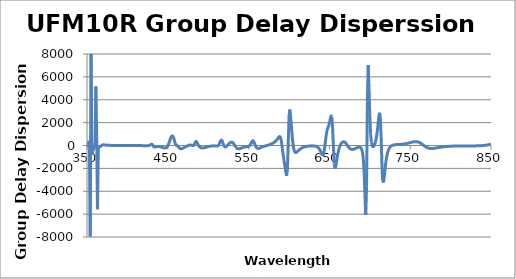
| Category | Group Delay Dispersion (fs^2) |
|---|---|
| 350.0 | -78 |
| 351.0 | 111 |
| 352.0 | 304 |
| 353.0 | -233 |
| 354.0 | -7963 |
| 355.0 | 8974 |
| 356.0 | -802 |
| 357.0 | -512 |
| 358.0 | -295 |
| 359.0 | -137 |
| 360.0 | 287 |
| 361.0 | 5158 |
| 362.0 | 761 |
| 363.0 | -5574 |
| 364.0 | -327 |
| 365.0 | -79 |
| 366.0 | -87 |
| 367.0 | -61 |
| 368.0 | 0 |
| 369.0 | 46 |
| 370.0 | 62 |
| 371.0 | 60 |
| 372.0 | 51 |
| 373.0 | 41 |
| 374.0 | 33 |
| 375.0 | 27 |
| 376.0 | 22 |
| 377.0 | 18 |
| 378.0 | 16 |
| 379.0 | 13 |
| 380.0 | 10 |
| 381.0 | 7 |
| 382.0 | 4 |
| 383.0 | 2 |
| 384.0 | 1 |
| 385.0 | 1 |
| 386.0 | 1 |
| 387.0 | 2 |
| 388.0 | 2 |
| 389.0 | 2 |
| 390.0 | 2 |
| 391.0 | 2 |
| 392.0 | 2 |
| 393.0 | 2 |
| 394.0 | 2 |
| 395.0 | 2 |
| 396.0 | 1 |
| 397.0 | 1 |
| 398.0 | 0 |
| 399.0 | -1 |
| 400.0 | 3 |
| 401.0 | -3 |
| 402.0 | -3 |
| 403.0 | -3 |
| 404.0 | -3 |
| 405.0 | -3 |
| 406.0 | -3 |
| 407.0 | -3 |
| 408.0 | -3 |
| 409.0 | -2 |
| 410.0 | -2 |
| 411.0 | -2 |
| 412.0 | -3 |
| 413.0 | -3 |
| 414.0 | -4 |
| 415.0 | -6 |
| 416.0 | -7 |
| 417.0 | -9 |
| 418.0 | -11 |
| 419.0 | -12 |
| 420.0 | -14 |
| 421.0 | -15 |
| 422.0 | -16 |
| 423.0 | -18 |
| 424.0 | -18 |
| 425.0 | -16 |
| 426.0 | -9 |
| 427.0 | 9 |
| 428.0 | 42 |
| 429.0 | 88 |
| 430.0 | 115 |
| 431.0 | 70 |
| 432.0 | -46 |
| 433.0 | -132 |
| 434.0 | -136 |
| 435.0 | -111 |
| 436.0 | -95 |
| 437.0 | -88 |
| 438.0 | -88 |
| 439.0 | -94 |
| 440.0 | -106 |
| 441.0 | -122 |
| 442.0 | -142 |
| 443.0 | -164 |
| 444.0 | -186 |
| 445.0 | -205 |
| 446.0 | -216 |
| 447.0 | -212 |
| 448.0 | -186 |
| 449.0 | -130 |
| 450.0 | -28 |
| 451.0 | 129 |
| 452.0 | 338 |
| 453.0 | 558 |
| 454.0 | 732 |
| 455.0 | 824 |
| 456.0 | 828 |
| 457.0 | 723 |
| 458.0 | 484 |
| 459.0 | 214 |
| 460.0 | 58 |
| 461.0 | 5 |
| 462.0 | -38 |
| 463.0 | -111 |
| 464.0 | -194 |
| 465.0 | -258 |
| 466.0 | -287 |
| 467.0 | -284 |
| 468.0 | -259 |
| 469.0 | -224 |
| 470.0 | -184 |
| 471.0 | -145 |
| 472.0 | -107 |
| 473.0 | -71 |
| 474.0 | -38 |
| 475.0 | -8 |
| 476.0 | 17 |
| 477.0 | 33 |
| 478.0 | 38 |
| 479.0 | 29 |
| 480.0 | 9 |
| 481.0 | -7 |
| 482.0 | 17 |
| 483.0 | 119 |
| 484.0 | 275 |
| 485.0 | 363 |
| 486.0 | 297 |
| 487.0 | 144 |
| 488.0 | 2 |
| 489.0 | -94 |
| 490.0 | -154 |
| 491.0 | -190 |
| 492.0 | -209 |
| 493.0 | -215 |
| 494.0 | -211 |
| 495.0 | -200 |
| 496.0 | -184 |
| 497.0 | -166 |
| 498.0 | -146 |
| 499.0 | -126 |
| 500.0 | -88 |
| 501.0 | -82 |
| 502.0 | -68 |
| 503.0 | -56 |
| 504.0 | -45 |
| 505.0 | -37 |
| 506.0 | -31 |
| 507.0 | -30 |
| 508.0 | -32 |
| 509.0 | -40 |
| 510.0 | -49 |
| 511.0 | -52 |
| 512.0 | -30 |
| 513.0 | 42 |
| 514.0 | 179 |
| 515.0 | 350 |
| 516.0 | 464 |
| 517.0 | 434 |
| 518.0 | 264 |
| 519.0 | 57 |
| 520.0 | -87 |
| 521.0 | -136 |
| 522.0 | -113 |
| 523.0 | -53 |
| 524.0 | 23 |
| 525.0 | 101 |
| 526.0 | 174 |
| 527.0 | 237 |
| 528.0 | 280 |
| 529.0 | 297 |
| 530.0 | 276 |
| 531.0 | 214 |
| 532.0 | 115 |
| 533.0 | -4 |
| 534.0 | -119 |
| 535.0 | -210 |
| 536.0 | -267 |
| 537.0 | -292 |
| 538.0 | -291 |
| 539.0 | -275 |
| 540.0 | -251 |
| 541.0 | -223 |
| 542.0 | -196 |
| 543.0 | -171 |
| 544.0 | -149 |
| 545.0 | -132 |
| 546.0 | -119 |
| 547.0 | -110 |
| 548.0 | -103 |
| 549.0 | -93 |
| 550.0 | -66 |
| 551.0 | -25 |
| 552.0 | 61 |
| 553.0 | 187 |
| 554.0 | 323 |
| 555.0 | 408 |
| 556.0 | 388 |
| 557.0 | 259 |
| 558.0 | 76 |
| 559.0 | -90 |
| 560.0 | -199 |
| 561.0 | -250 |
| 562.0 | -257 |
| 563.0 | -240 |
| 564.0 | -212 |
| 565.0 | -181 |
| 566.0 | -151 |
| 567.0 | -123 |
| 568.0 | -98 |
| 569.0 | -75 |
| 570.0 | -55 |
| 571.0 | -35 |
| 572.0 | -15 |
| 573.0 | 4 |
| 574.0 | 25 |
| 575.0 | 48 |
| 576.0 | 73 |
| 577.0 | 101 |
| 578.0 | 132 |
| 579.0 | 166 |
| 580.0 | 204 |
| 581.0 | 247 |
| 582.0 | 295 |
| 583.0 | 352 |
| 584.0 | 420 |
| 585.0 | 501 |
| 586.0 | 597 |
| 587.0 | 698 |
| 588.0 | 773 |
| 589.0 | 759 |
| 590.0 | 572 |
| 591.0 | 164 |
| 592.0 | -393 |
| 593.0 | -942 |
| 594.0 | -1396 |
| 595.0 | -1807 |
| 596.0 | -2276 |
| 597.0 | -2660 |
| 598.0 | -2153 |
| 599.0 | 43 |
| 600.0 | 2488 |
| 601.0 | 3147 |
| 602.0 | 2569 |
| 603.0 | 1655 |
| 604.0 | 798 |
| 605.0 | 126 |
| 606.0 | -311 |
| 607.0 | -535 |
| 608.0 | -609 |
| 609.0 | -598 |
| 610.0 | -547 |
| 611.0 | -483 |
| 612.0 | -418 |
| 613.0 | -357 |
| 614.0 | -303 |
| 615.0 | -256 |
| 616.0 | -215 |
| 617.0 | -180 |
| 618.0 | -151 |
| 619.0 | -127 |
| 620.0 | -106 |
| 621.0 | -89 |
| 622.0 | -75 |
| 623.0 | -63 |
| 624.0 | -54 |
| 625.0 | -46 |
| 626.0 | -40 |
| 627.0 | -36 |
| 628.0 | -33 |
| 629.0 | -32 |
| 630.0 | -34 |
| 631.0 | -38 |
| 632.0 | -47 |
| 633.0 | -62 |
| 634.0 | -86 |
| 635.0 | -123 |
| 636.0 | -177 |
| 637.0 | -256 |
| 638.0 | -363 |
| 639.0 | -500 |
| 640.0 | -655 |
| 641.0 | -788 |
| 642.0 | -826 |
| 643.0 | -669 |
| 644.0 | -264 |
| 645.0 | 312 |
| 646.0 | 873 |
| 647.0 | 1276 |
| 648.0 | 1520 |
| 649.0 | 1701 |
| 650.0 | 1954 |
| 651.0 | 2289 |
| 652.0 | 2582 |
| 653.0 | 2489 |
| 654.0 | 1530 |
| 655.0 | -165 |
| 656.0 | -1579 |
| 657.0 | -2035 |
| 658.0 | -1793 |
| 659.0 | -1327 |
| 660.0 | -884 |
| 661.0 | -530 |
| 662.0 | -261 |
| 663.0 | -58 |
| 664.0 | 94 |
| 665.0 | 206 |
| 666.0 | 280 |
| 667.0 | 318 |
| 668.0 | 321 |
| 669.0 | 289 |
| 670.0 | 226 |
| 671.0 | 138 |
| 672.0 | 36 |
| 673.0 | -68 |
| 674.0 | -164 |
| 675.0 | -241 |
| 676.0 | -297 |
| 677.0 | -331 |
| 678.0 | -343 |
| 679.0 | -340 |
| 680.0 | -323 |
| 681.0 | -298 |
| 682.0 | -269 |
| 683.0 | -237 |
| 684.0 | -205 |
| 685.0 | -177 |
| 686.0 | -155 |
| 687.0 | -145 |
| 688.0 | -157 |
| 689.0 | -210 |
| 690.0 | -342 |
| 691.0 | -627 |
| 692.0 | -1211 |
| 693.0 | -2352 |
| 694.0 | -4284 |
| 695.0 | -6077 |
| 696.0 | -3552 |
| 697.0 | 3876 |
| 698.0 | 7044 |
| 699.0 | 5058 |
| 700.0 | 2570 |
| 701.0 | 1021 |
| 702.0 | 284 |
| 703.0 | -28 |
| 704.0 | -106 |
| 705.0 | -51 |
| 706.0 | 95 |
| 707.0 | 323 |
| 708.0 | 650 |
| 709.0 | 1104 |
| 710.0 | 1703 |
| 711.0 | 2389 |
| 712.0 | 2870 |
| 713.0 | 2495 |
| 714.0 | 751 |
| 715.0 | -1622 |
| 716.0 | -3093 |
| 717.0 | -3232 |
| 718.0 | -2664 |
| 719.0 | -1971 |
| 720.0 | -1386 |
| 721.0 | -947 |
| 722.0 | -633 |
| 723.0 | -411 |
| 724.0 | -256 |
| 725.0 | -147 |
| 726.0 | -72 |
| 727.0 | -20 |
| 728.0 | 16 |
| 729.0 | 40 |
| 730.0 | 56 |
| 731.0 | 67 |
| 732.0 | 75 |
| 733.0 | 80 |
| 734.0 | 84 |
| 735.0 | 88 |
| 736.0 | 91 |
| 737.0 | 95 |
| 738.0 | 100 |
| 739.0 | 106 |
| 740.0 | 113 |
| 741.0 | 121 |
| 742.0 | 130 |
| 743.0 | 141 |
| 744.0 | 153 |
| 745.0 | 167 |
| 746.0 | 182 |
| 747.0 | 198 |
| 748.0 | 215 |
| 749.0 | 233 |
| 750.0 | 252 |
| 751.0 | 270 |
| 752.0 | 288 |
| 753.0 | 304 |
| 754.0 | 318 |
| 755.0 | 329 |
| 756.0 | 335 |
| 757.0 | 337 |
| 758.0 | 332 |
| 759.0 | 320 |
| 760.0 | 301 |
| 761.0 | 274 |
| 762.0 | 239 |
| 763.0 | 198 |
| 764.0 | 152 |
| 765.0 | 101 |
| 766.0 | 48 |
| 767.0 | -4 |
| 768.0 | -55 |
| 769.0 | -102 |
| 770.0 | -144 |
| 771.0 | -179 |
| 772.0 | -208 |
| 773.0 | -230 |
| 774.0 | -246 |
| 775.0 | -256 |
| 776.0 | -260 |
| 777.0 | -260 |
| 778.0 | -256 |
| 779.0 | -249 |
| 780.0 | -240 |
| 781.0 | -229 |
| 782.0 | -217 |
| 783.0 | -205 |
| 784.0 | -193 |
| 785.0 | -180 |
| 786.0 | -168 |
| 787.0 | -156 |
| 788.0 | -145 |
| 789.0 | -135 |
| 790.0 | -125 |
| 791.0 | -116 |
| 792.0 | -107 |
| 793.0 | -100 |
| 794.0 | -93 |
| 795.0 | -86 |
| 796.0 | -80 |
| 797.0 | -75 |
| 798.0 | -70 |
| 799.0 | -66 |
| 800.0 | -62 |
| 801.0 | -59 |
| 802.0 | -56 |
| 803.0 | -53 |
| 804.0 | -51 |
| 805.0 | -49 |
| 806.0 | -47 |
| 807.0 | -45 |
| 808.0 | -44 |
| 809.0 | -43 |
| 810.0 | -42 |
| 811.0 | -41 |
| 812.0 | -41 |
| 813.0 | -40 |
| 814.0 | -40 |
| 815.0 | -40 |
| 816.0 | -39 |
| 817.0 | -39 |
| 818.0 | -39 |
| 819.0 | -39 |
| 820.0 | -39 |
| 821.0 | -39 |
| 822.0 | -39 |
| 823.0 | -39 |
| 824.0 | -39 |
| 825.0 | -39 |
| 826.0 | -38 |
| 827.0 | -38 |
| 828.0 | -37 |
| 829.0 | -36 |
| 830.0 | -35 |
| 831.0 | -34 |
| 832.0 | -32 |
| 833.0 | -30 |
| 834.0 | -28 |
| 835.0 | -25 |
| 836.0 | -22 |
| 837.0 | -18 |
| 838.0 | -13 |
| 839.0 | -8 |
| 840.0 | -2 |
| 841.0 | 5 |
| 842.0 | 13 |
| 843.0 | 21 |
| 844.0 | 31 |
| 845.0 | 42 |
| 846.0 | 54 |
| 847.0 | 68 |
| 848.0 | 83 |
| 849.0 | 99 |
| 850.0 | 116 |